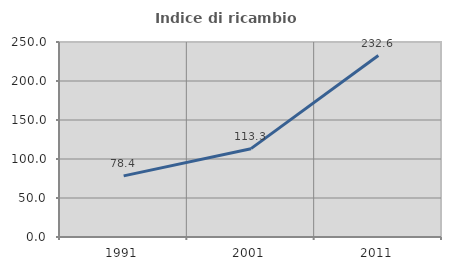
| Category | Indice di ricambio occupazionale  |
|---|---|
| 1991.0 | 78.369 |
| 2001.0 | 113.252 |
| 2011.0 | 232.618 |